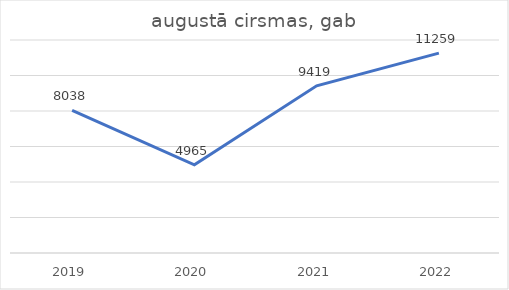
| Category | augustā cirsmas, gab |
|---|---|
| 2019.0 | 8038 |
| 2020.0 | 4965 |
| 2021.0 | 9419 |
| 2022.0 | 11259 |